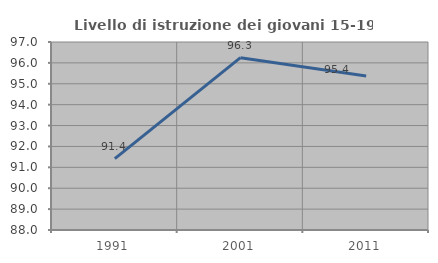
| Category | Livello di istruzione dei giovani 15-19 anni |
|---|---|
| 1991.0 | 91.418 |
| 2001.0 | 96.25 |
| 2011.0 | 95.37 |